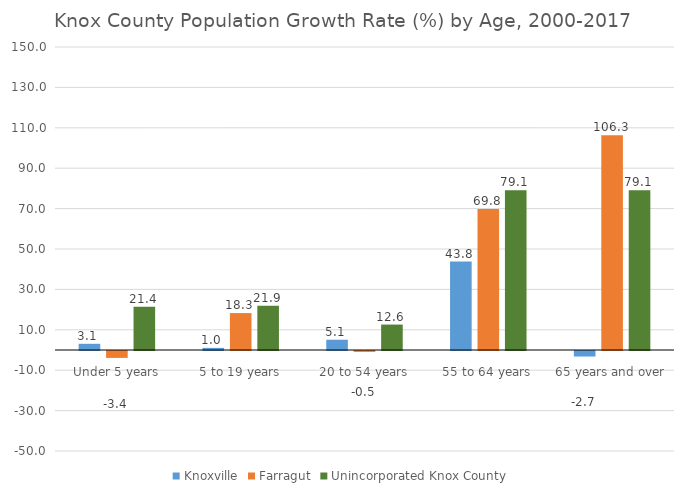
| Category | Knoxville | Farragut | Unincorporated Knox County |
|---|---|---|---|
| Under 5 years | 3.069 | -3.413 | 21.368 |
| 5 to 19 years | 1.047 | 18.281 | 21.948 |
| 20 to 54 years | 5.085 | -0.455 | 12.591 |
| 55 to 64 years | 43.783 | 69.812 | 79.141 |
| 65 years and over | -2.729 | 106.259 | 79.059 |